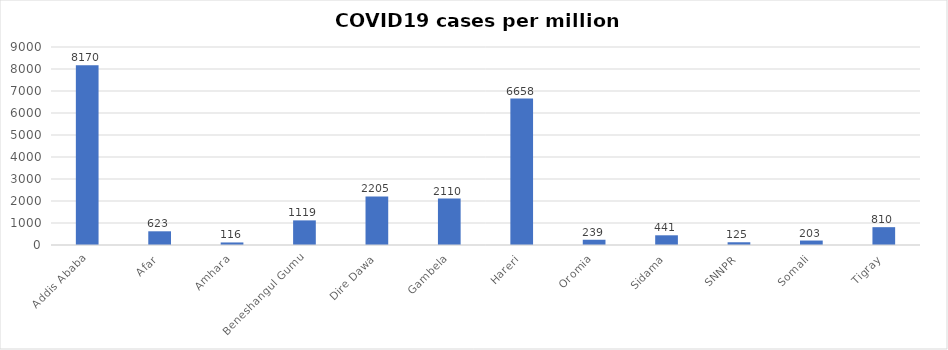
| Category | Case per million |
|---|---|
| Addis Ababa | 8170.375 |
| Afar | 622.858 |
| Amhara | 115.734 |
| Beneshangul Gumu | 1118.708 |
| Dire Dawa | 2204.775 |
| Gambela | 2110.111 |
| Hareri | 6657.672 |
| Oromia | 238.678 |
| Sidama | 441.082 |
| SNNPR | 124.637 |
| Somali | 202.753 |
| Tigray | 810.214 |